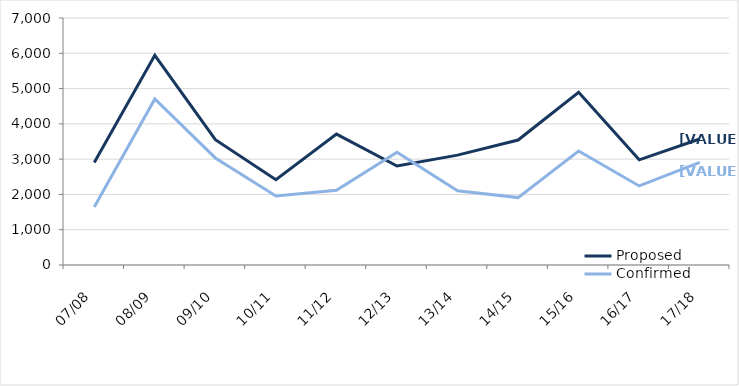
| Category | Proposed | Confirmed |
|---|---|---|
| 07/08 | 2905 | 1643 |
| 08/09 | 5941 | 4705 |
| 09/10 | 3550 | 3034 |
| 10/11 | 2419 | 1957 |
| 11/12 | 3711 | 2120 |
| 12/13 | 2806 | 3194 |
| 13/14 | 3113 | 2103 |
| 14/15 | 3542 | 1910 |
| 15/16 | 4893 | 3229 |
| 16/17 | 2981 | 2240 |
| 17/18 | 3570 | 2907 |